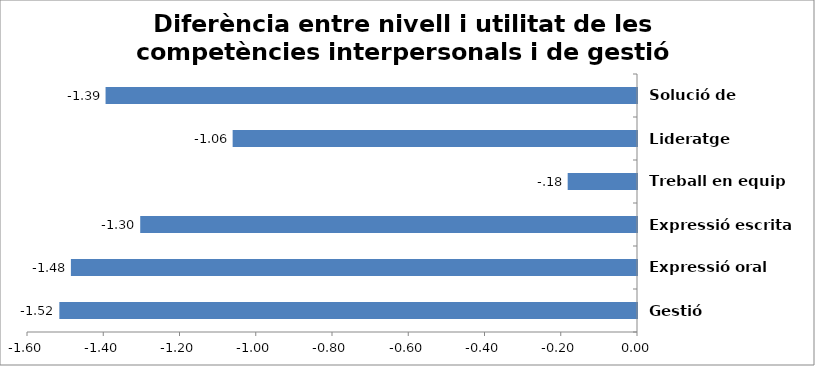
| Category | ARQUITECTURA |
|---|---|
| Gestió | -1.515 |
| Expressió oral | -1.485 |
| Expressió escrita | -1.303 |
| Treball en equip | -0.182 |
| Lideratge | -1.061 |
| Solució de prombles | -1.394 |